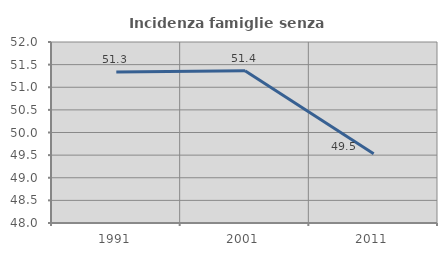
| Category | Incidenza famiglie senza nuclei |
|---|---|
| 1991.0 | 51.335 |
| 2001.0 | 51.364 |
| 2011.0 | 49.533 |